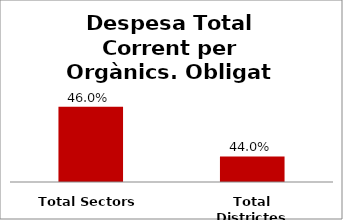
| Category | Series 0 |
|---|---|
| Total Sectors | 0.46 |
| Total Districtes | 0.44 |